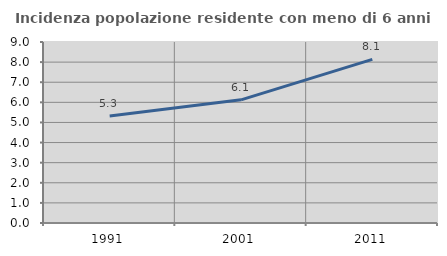
| Category | Incidenza popolazione residente con meno di 6 anni |
|---|---|
| 1991.0 | 5.321 |
| 2001.0 | 6.123 |
| 2011.0 | 8.136 |